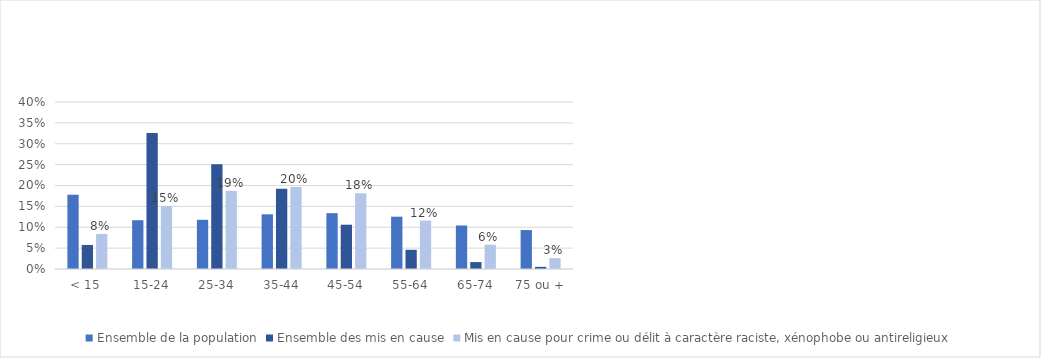
| Category | Ensemble de la population | Ensemble des mis en cause | Mis en cause pour crime ou délit à caractère raciste, xénophobe ou antireligieux |
|---|---|---|---|
| < 15 | 0.178 | 0.058 | 0.084 |
| 15-24 | 0.117 | 0.326 | 0.151 |
| 25-34 | 0.118 | 0.251 | 0.187 |
| 35-44 | 0.131 | 0.192 | 0.197 |
| 45-54 | 0.134 | 0.106 | 0.181 |
| 55-64 | 0.125 | 0.046 | 0.116 |
| 65-74 | 0.104 | 0.017 | 0.058 |
| 75 ou + | 0.093 | 0.005 | 0.026 |